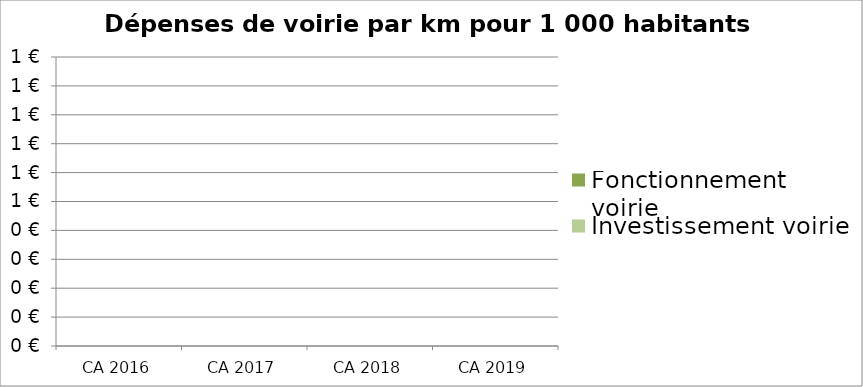
| Category | Fonctionnement voirie | Investissement voirie |
|---|---|---|
| CA 2016 | 0 | 0 |
| CA 2017 | 0 | 0 |
| CA 2018 | 0 | 0 |
| CA 2019 | 0 | 0 |